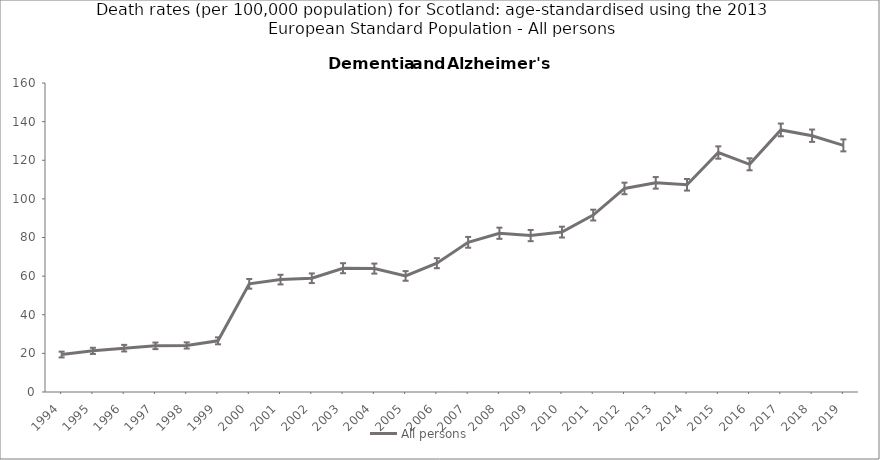
| Category | All persons |
|---|---|
| 1994.0 | 19.4 |
| 1995.0 | 21.3 |
| 1996.0 | 22.7 |
| 1997.0 | 23.9 |
| 1998.0 | 24.1 |
| 1999.0 | 26.5 |
| 2000.0 | 56 |
| 2001.0 | 58.2 |
| 2002.0 | 58.9 |
| 2003.0 | 64.1 |
| 2004.0 | 63.9 |
| 2005.0 | 60.1 |
| 2006.0 | 66.7 |
| 2007.0 | 77.5 |
| 2008.0 | 82.2 |
| 2009.0 | 81 |
| 2010.0 | 82.8 |
| 2011.0 | 91.6 |
| 2012.0 | 105.4 |
| 2013.0 | 108.3 |
| 2014.0 | 107.3 |
| 2015.0 | 124 |
| 2016.0 | 117.9 |
| 2017.0 | 135.7 |
| 2018.0 | 132.7 |
| 2019.0 | 127.7 |